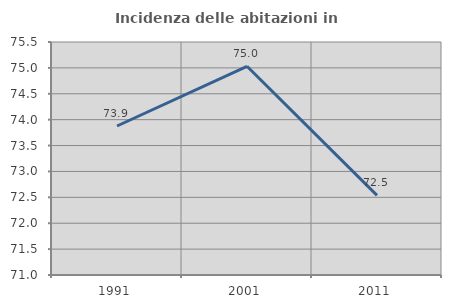
| Category | Incidenza delle abitazioni in proprietà  |
|---|---|
| 1991.0 | 73.878 |
| 2001.0 | 75.031 |
| 2011.0 | 72.537 |